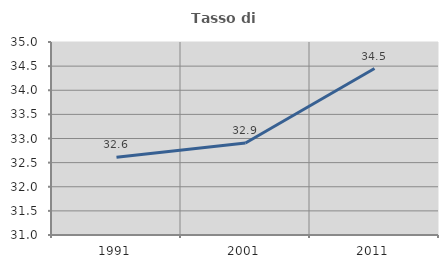
| Category | Tasso di occupazione   |
|---|---|
| 1991.0 | 32.611 |
| 2001.0 | 32.907 |
| 2011.0 | 34.45 |